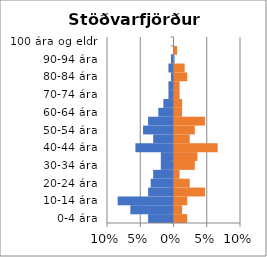
| Category | % karlar | %konur |
|---|---|---|
| 0-4 ára | -0.038 | 0.019 |
| 5-9 ára | -0.065 | 0.011 |
| 10-14 ára | -0.084 | 0.019 |
| 15-19 ára | -0.038 | 0.046 |
| 20-24 ára | -0.034 | 0.023 |
| 25-29 ára | -0.031 | 0.008 |
| 30-34 ára | -0.019 | 0.031 |
| 35-39 ára | -0.019 | 0.034 |
| 40-44 ára | -0.057 | 0.065 |
| 45-49 ára | -0.031 | 0.023 |
| 50-54 ára | -0.046 | 0.031 |
| 55-59 ára | -0.038 | 0.046 |
| 60-64 ára | -0.023 | 0.011 |
| 65-69 ára | -0.015 | 0.011 |
| 70-74 ára | -0.008 | 0.008 |
| 75-79 ára | -0.008 | 0.008 |
| 80-84 ára | -0.004 | 0.019 |
| 85-89 ára | -0.008 | 0.015 |
| 90-94 ára | -0.004 | 0 |
| 95-99 ára | 0 | 0.004 |
| 100 ára og eldri | 0 | 0 |